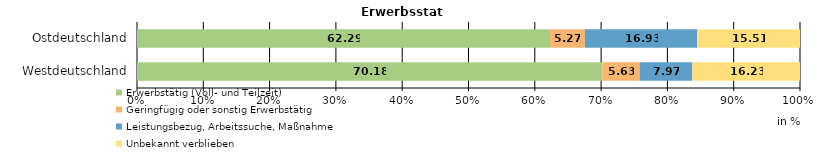
| Category | Erwerbstätig (Voll- und Teilzeit) | Geringfügig oder sonstig Erwerbstätig | Leistungsbezug, Arbeitssuche, Maßnahme | Unbekannt verblieben |
|---|---|---|---|---|
| 0 | 70.177 | 5.626 | 7.967 | 16.23 |
| 1 | 62.292 | 5.268 | 16.925 | 15.514 |